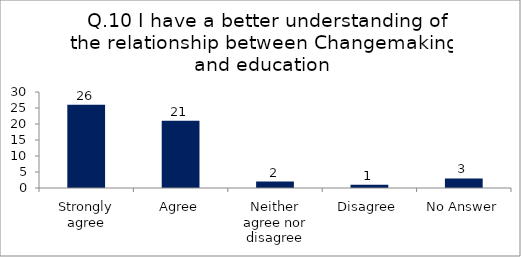
| Category | Q.10 I have a better understanding of the relationship between Changemaking and education |
|---|---|
| Strongly agree | 26 |
| Agree | 21 |
| Neither agree nor disagree | 2 |
| Disagree | 1 |
| No Answer | 3 |